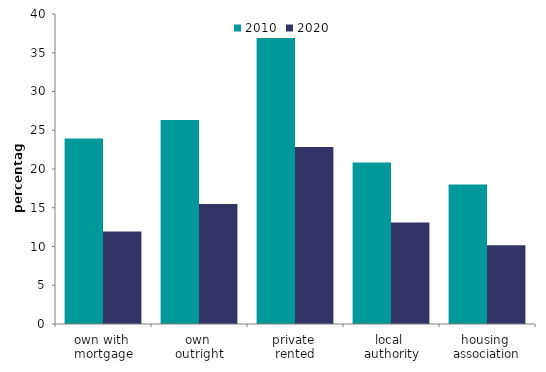
| Category | 2010 | 2020 |
|---|---|---|
| own with 
mortgage | 23.937 | 11.937 |
| own 
outright | 26.321 | 15.47 |
| private 
rented | 36.912 | 22.846 |
| local 
authority | 20.827 | 13.102 |
| housing 
association | 18.008 | 10.148 |